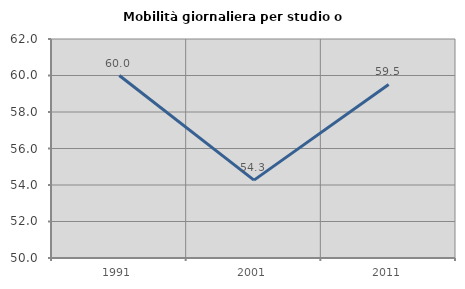
| Category | Mobilità giornaliera per studio o lavoro |
|---|---|
| 1991.0 | 60 |
| 2001.0 | 54.268 |
| 2011.0 | 59.512 |